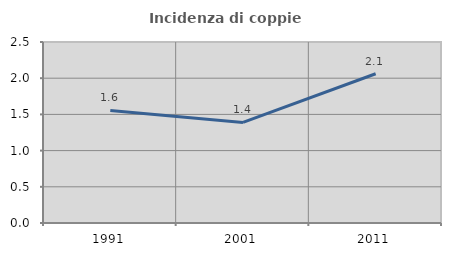
| Category | Incidenza di coppie miste |
|---|---|
| 1991.0 | 1.554 |
| 2001.0 | 1.389 |
| 2011.0 | 2.062 |